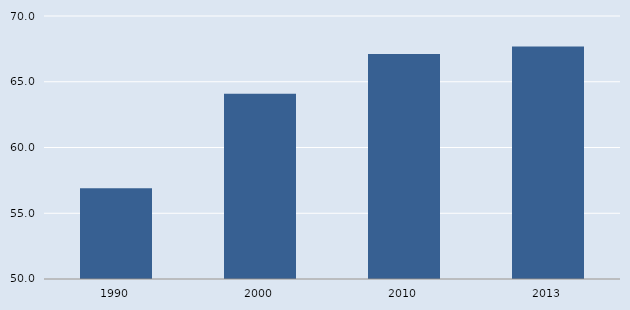
| Category | Europe |
|---|---|
| 1990.0 | 56.901 |
| 2000.0 | 64.095 |
| 2010.0 | 67.118 |
| 2013.0 | 67.686 |